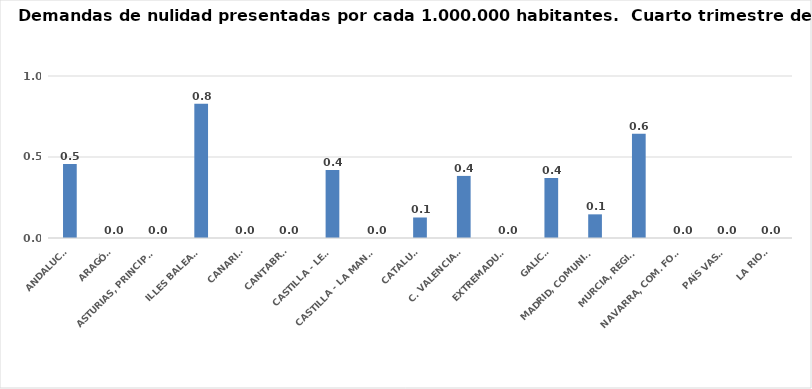
| Category | Series 0 |
|---|---|
| ANDALUCÍA | 0.457 |
| ARAGÓN | 0 |
| ASTURIAS, PRINCIPADO | 0 |
| ILLES BALEARS | 0.829 |
| CANARIAS | 0 |
| CANTABRIA | 0 |
| CASTILLA - LEÓN | 0.42 |
| CASTILLA - LA MANCHA | 0 |
| CATALUÑA | 0.127 |
| C. VALENCIANA | 0.383 |
| EXTREMADURA | 0 |
| GALICIA | 0.37 |
| MADRID, COMUNIDAD | 0.146 |
| MURCIA, REGIÓN | 0.644 |
| NAVARRA, COM. FORAL | 0 |
| PAÍS VASCO | 0 |
| LA RIOJA | 0 |